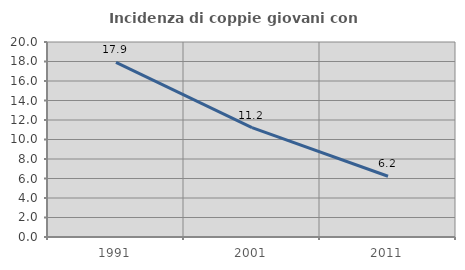
| Category | Incidenza di coppie giovani con figli |
|---|---|
| 1991.0 | 17.906 |
| 2001.0 | 11.209 |
| 2011.0 | 6.231 |